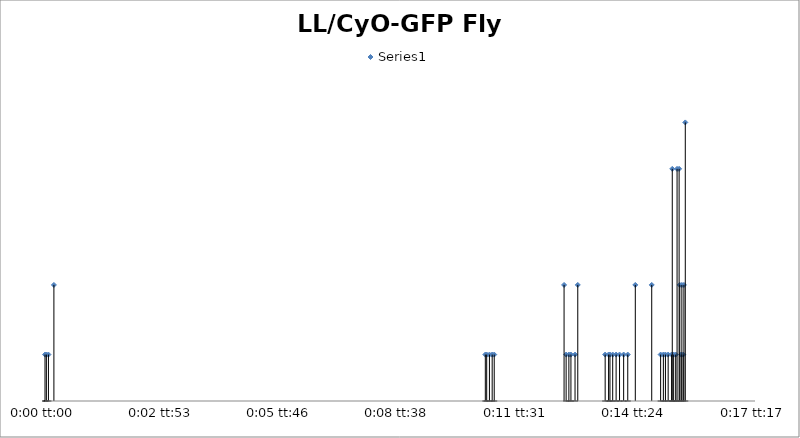
| Category | Series 0 |
|---|---|
| 0.0 | 2 |
| 2.314814814816102e-05 | 2 |
| 5.787037037036091e-05 | 2 |
| 0.00015046296296297723 | 5 |
| 0.007442129629629646 | 2 |
| 0.007465277777777779 | 2 |
| 0.007511574074074073 | 2 |
| 0.007557870370370368 | 2 |
| 0.007592592592592595 | 2 |
| 0.008773148148148169 | 5 |
| 0.008807870370370369 | 2 |
| 0.008854166666666663 | 2 |
| 0.00888888888888889 | 2 |
| 0.008958333333333346 | 2 |
| 0.00900462962962964 | 5 |
| 0.00946759259259261 | 2 |
| 0.009525462962962972 | 2 |
| 0.009548611111111105 | 2 |
| 0.009594907407407427 | 2 |
| 0.009652777777777788 | 2 |
| 0.009710648148148149 | 2 |
| 0.009780092592592604 | 2 |
| 0.00984953703703706 | 2 |
| 0.009976851851851876 | 5 |
| 0.010254629629629641 | 5 |
| 0.01040509259259259 | 2 |
| 0.010451388888888885 | 2 |
| 0.010486111111111113 | 2 |
| 0.010532407407407407 | 2 |
| 0.010590277777777796 | 2 |
| 0.010601851851851862 | 10 |
| 0.010624999999999996 | 2 |
| 0.010659722222222223 | 2 |
| 0.010682870370370384 | 10 |
| 0.010717592592592584 | 10 |
| 0.010729166666666679 | 5 |
| 0.010752314814814812 | 2 |
| 0.010763888888888906 | 5 |
| 0.01078703703703704 | 2 |
| 0.010798611111111134 | 5 |
| 0.010821759259259267 | 12 |